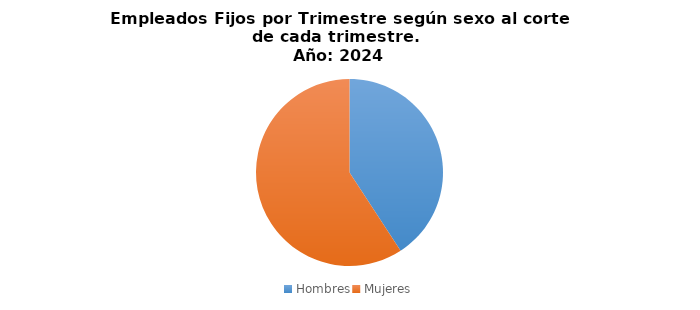
| Category | Marzo |
|---|---|
| Hombres | 153 |
| Mujeres | 222 |